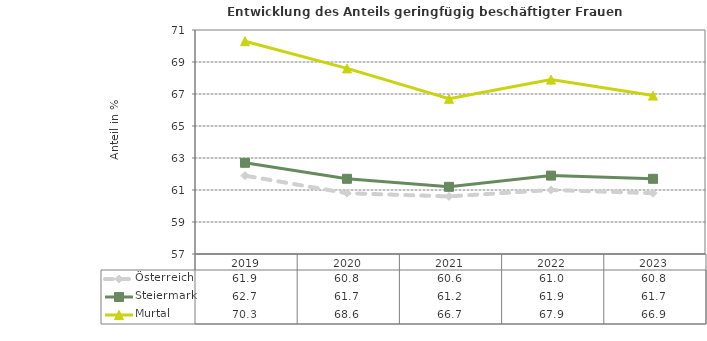
| Category | Österreich | Steiermark | Murtal |
|---|---|---|---|
| 2023.0 | 60.8 | 61.7 | 66.9 |
| 2022.0 | 61 | 61.9 | 67.9 |
| 2021.0 | 60.6 | 61.2 | 66.7 |
| 2020.0 | 60.8 | 61.7 | 68.6 |
| 2019.0 | 61.9 | 62.7 | 70.3 |